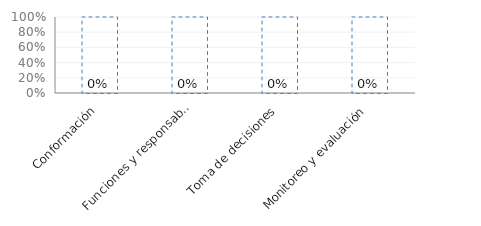
| Category | Series 0 |
|---|---|
| Conformación | 0 |
| Funciones y responsabilidades | 0 |
| Toma de decisiones | 0 |
| Monitoreo y evaluación | 0 |